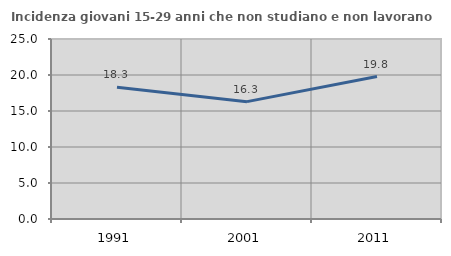
| Category | Incidenza giovani 15-29 anni che non studiano e non lavorano  |
|---|---|
| 1991.0 | 18.291 |
| 2001.0 | 16.3 |
| 2011.0 | 19.792 |